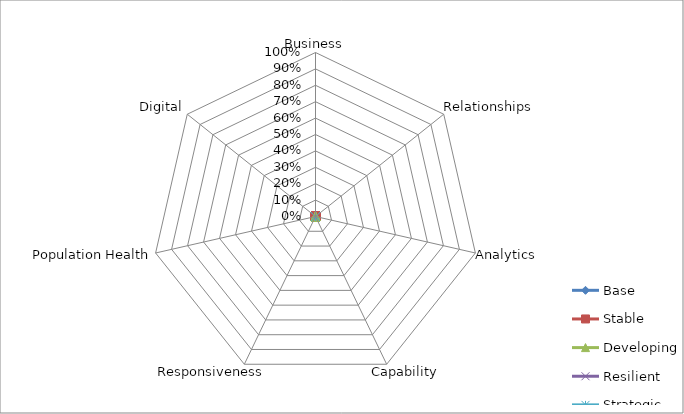
| Category | Base | Stable | Developing | Resilient | Strategic |
|---|---|---|---|---|---|
| 0 | 0 | 0 | 0 | 0 | 0 |
| 1 | 0 | 0 | 0 | 0 | 0 |
| 2 | 0 | 0 | 0 | 0 | 0 |
| 3 | 0 | 0 | 0 | 0 | 0 |
| 4 | 0 | 0 | 0 | 0 | 0 |
| 5 | 0 | 0 | 0 | 0 | 0 |
| 6 | 0 | 0 | 0 | 0 | 0 |